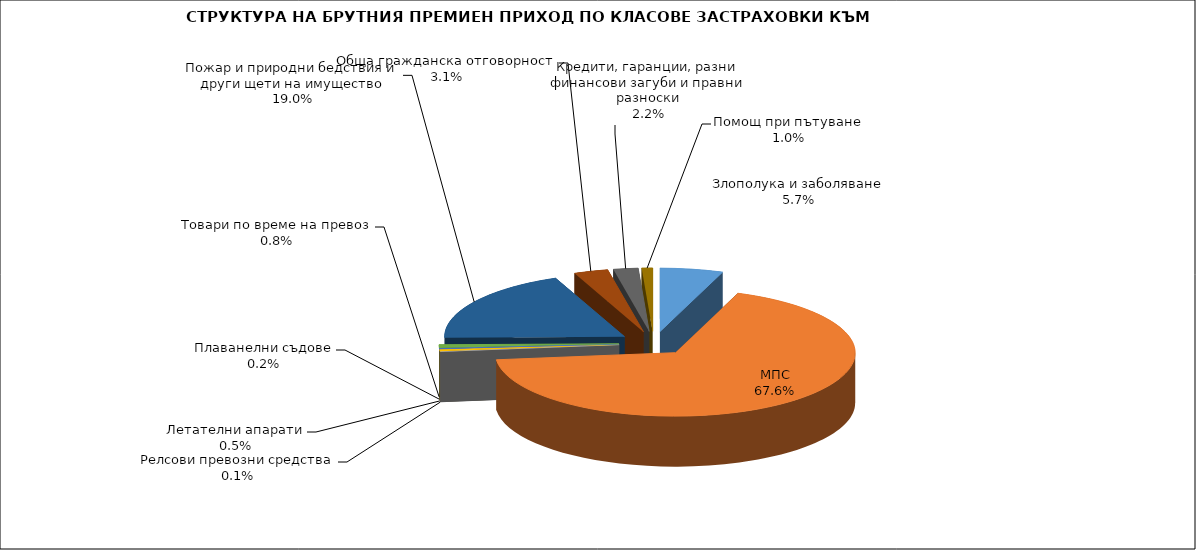
| Category | Злополука и заболяване |
|---|---|
| Злополука и заболяване | 0.057 |
| МПС | 0.676 |
| Релсови превозни средства | 0.001 |
| Летателни апарати | 0.005 |
| Плаванелни съдове | 0.002 |
| Товари по време на превоз | 0.008 |
| Пожар и природни бедствия и други щети на имущество | 0.19 |
| Обща гражданска отговорност | 0.031 |
| Кредити, гаранции, разни финансови загуби и правни разноски | 0.022 |
| Помощ при пътуване | 0.01 |